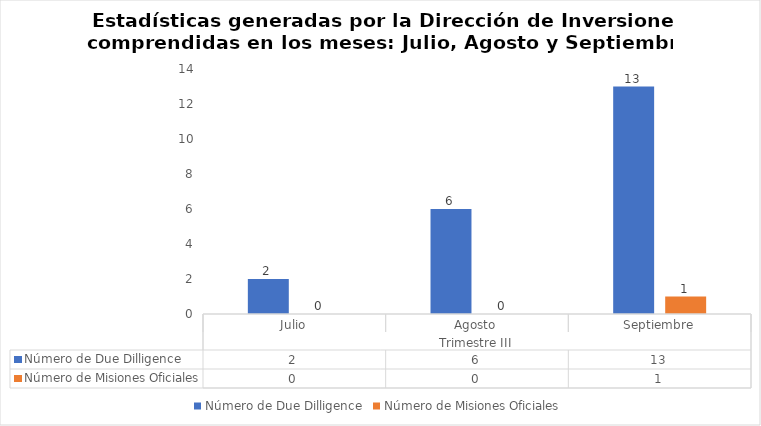
| Category | Número de Due Dilligence | Número de Misiones Oficiales |
|---|---|---|
| 0 | 2 | 0 |
| 1 | 6 | 0 |
| 2 | 13 | 1 |